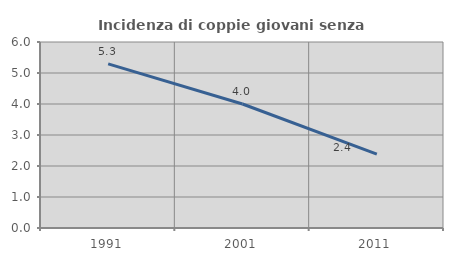
| Category | Incidenza di coppie giovani senza figli |
|---|---|
| 1991.0 | 5.296 |
| 2001.0 | 4 |
| 2011.0 | 2.381 |